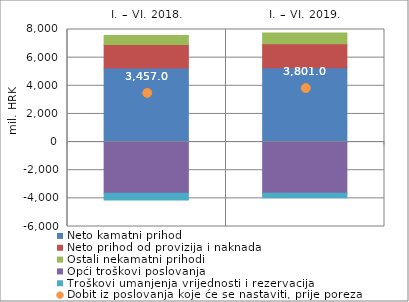
| Category | Neto kamatni prihod | Neto prihod od provizija i naknada | Ostali nekamatni prihodi | Opći troškovi poslovanja | Troškovi umanjenja vrijednosti i rezervacija |
|---|---|---|---|---|---|
| I. – VI. 2018. | 5258.432 | 1670.119 | 648 | -3634.396 | -485.142 |
| I. – VI. 2019. | 5286.047 | 1706.245 | 761.875 | -3643.525 | -309.648 |